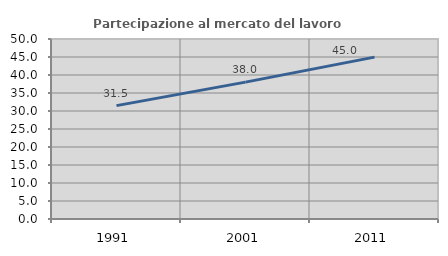
| Category | Partecipazione al mercato del lavoro  femminile |
|---|---|
| 1991.0 | 31.494 |
| 2001.0 | 38.024 |
| 2011.0 | 44.961 |